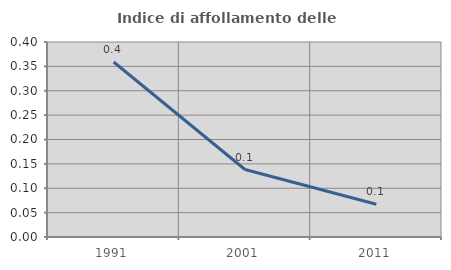
| Category | Indice di affollamento delle abitazioni  |
|---|---|
| 1991.0 | 0.359 |
| 2001.0 | 0.138 |
| 2011.0 | 0.067 |